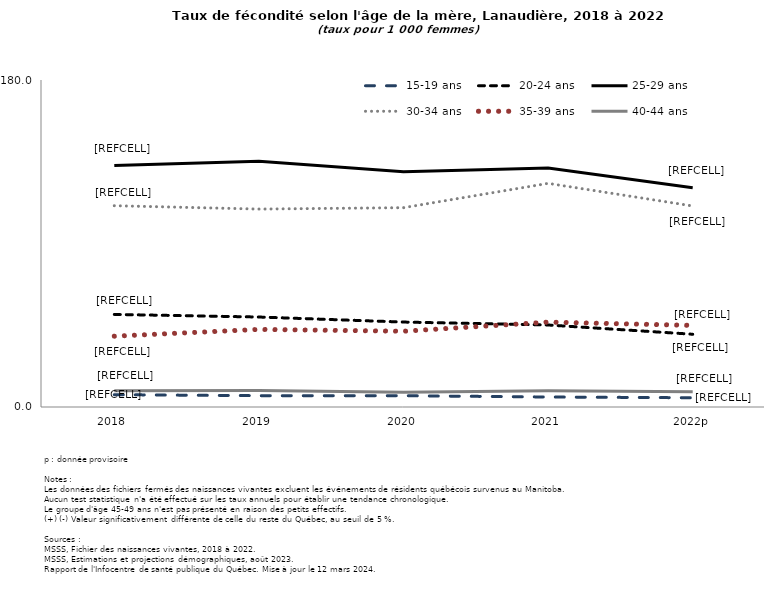
| Category | 15-19 ans | 20-24 ans | 25-29 ans | 30-34 ans | 35-39 ans | 40-44 ans |
|---|---|---|---|---|---|---|
| 2018 | 6.78 | 50.958 | 133 | 110.8 | 38.976 | 8.976 |
| 2019 | 6.228 | 49.525 | 135.306 | 108.952 | 42.713 | 9.148 |
| 2020 | 6.215 | 46.752 | 129.563 | 109.72 | 41.708 | 8.078 |
| 2021 | 5.506 | 45.146 | 131.494 | 123.106 | 46.715 | 8.997 |
| 2022p | 5.088 | 40.045 | 120.629 | 110.65 | 44.922 | 8.33 |